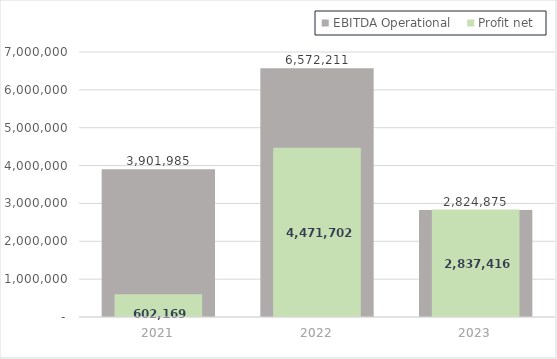
| Category | EBITDA Operational |
|---|---|
| 2021.0 | 3901984.951 |
| 2022.0 | 6572210.831 |
| 2023.0 | 2824874.764 |